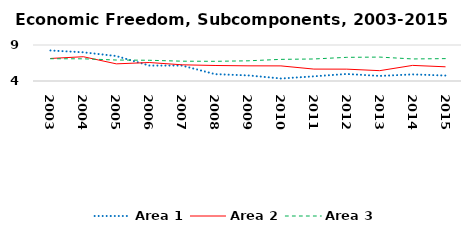
| Category | Area 1 | Area 2 | Area 3 |
|---|---|---|---|
| 2003.0 | 8.239 | 7.131 | 7.093 |
| 2004.0 | 7.984 | 7.372 | 7.081 |
| 2005.0 | 7.465 | 6.381 | 6.914 |
| 2006.0 | 6.147 | 6.566 | 6.88 |
| 2007.0 | 6.14 | 6.25 | 6.751 |
| 2008.0 | 4.951 | 6.154 | 6.734 |
| 2009.0 | 4.777 | 6.107 | 6.803 |
| 2010.0 | 4.346 | 6.098 | 7.005 |
| 2011.0 | 4.649 | 5.654 | 7.059 |
| 2012.0 | 4.974 | 5.647 | 7.287 |
| 2013.0 | 4.704 | 5.436 | 7.321 |
| 2014.0 | 4.918 | 6.166 | 7.062 |
| 2015.0 | 4.758 | 5.971 | 7.108 |